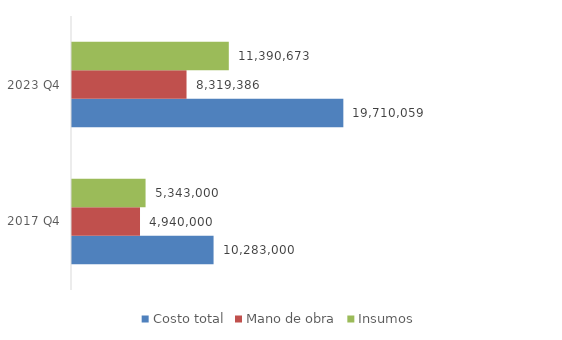
| Category | Costo total | Mano de obra | Insumos |
|---|---|---|---|
| 2017 Q4 | 10283000 | 4940000 | 5343000 |
| 2023 Q4 | 19710059.144 | 8319386 | 11390673.144 |